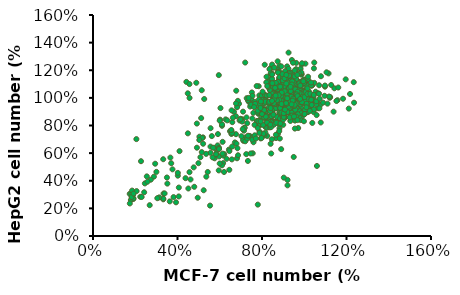
| Category | HepG2 |
|---|---|
| 0.9499618999237999 | 0.904 |
| 0.8483616967233935 | 0.895 |
| 0.9154178308356616 | 0.982 |
| 0.9621539243078486 | 0.94 |
| 0.6817373634747269 | 0.563 |
| 1.0261620523241046 | 0.958 |
| 0.9885699771399543 | 0.863 |
| 0.9560579121158242 | 0.835 |
| 0.5120650241300483 | 0.854 |
| 0.8483616967233935 | 0.812 |
| 0.9306578613157226 | 0.991 |
| 0.8859537719075438 | 0.996 |
| 0.8768097536195072 | 0.963 |
| 1.0353060706121413 | 1.005 |
| 1.0170180340360682 | 1.014 |
| 1.034290068580137 | 0.93 |
| 0.9824739649479299 | 0.921 |
| 0.969265938531877 | 0.918 |
| 0.9001778003556007 | 0.946 |
| 0.905257810515621 | 0.923 |
| 0.8757937515875032 | 0.955 |
| 0.8879857759715519 | 0.935 |
| 0.936753873507747 | 0.854 |
| 0.9865379730759462 | 0.925 |
| 1.0525781051562104 | 0.971 |
| 1.0373380746761494 | 1 |
| 0.9540259080518161 | 1.018 |
| 0.9611379222758446 | 1.062 |
| 0.9357378714757429 | 0.979 |
| 0.9499618999237999 | 0.98 |
| 1.0363220726441453 | 0.952 |
| 1.0759461518923037 | 0.949 |
| 1.0353060706121413 | 1.088 |
| 0.9824739649479299 | 0.953 |
| 0.936753873507747 | 0.979 |
| 0.9144018288036576 | 0.93 |
| 0.4490728981457963 | 0.743 |
| 1.0078740157480315 | 0.949 |
| 1.1389382778765558 | 0.9 |
| 0.9255778511557023 | 0.894 |
| 1.062738125476251 | 0.966 |
| 0.9743459486918974 | 0.984 |
| 1.032258064516129 | 0.954 |
| 0.5760731521463043 | 0.563 |
| 0.904241808483617 | 0.964 |
| 0.9357378714757429 | 0.968 |
| 0.9702819405638812 | 0.972 |
| 0.9804419608839218 | 1.044 |
| 0.9286258572517145 | 0.953 |
| 1.016002032004064 | 0.971 |
| 0.9946659893319787 | 1.055 |
| 1.0048260096520194 | 0.965 |
| 0.9306578613157226 | 0.988 |
| 1.0200660401320802 | 0.934 |
| 1.1206502413004826 | 1.001 |
| 1.0891541783083567 | 0.966 |
| 0.9479298958597917 | 1.001 |
| 0.7772415544831089 | 0.814 |
| 0.8910337820675641 | 1.035 |
| 0.9662179324358648 | 0.981 |
| 0.8625857251714504 | 0.961 |
| 0.9733299466598934 | 0.915 |
| 1.157226314452629 | 0.983 |
| 1.1836423672847345 | 0.994 |
| 0.858521717043434 | 0.997 |
| 0.9641859283718568 | 1.006 |
| 0.9133858267716536 | 0.923 |
| 0.8839217678435357 | 0.892 |
| 0.8859537719075438 | 0.967 |
| 1.030226060452121 | 0.991 |
| 0.983489966979934 | 0.839 |
| 1.016002032004064 | 0.98 |
| 0.9286258572517145 | 0.996 |
| 0.9113538227076454 | 1.092 |
| 0.8473456946913894 | 0.837 |
| 0.6136652273304547 | 0.682 |
| 0.9499618999237999 | 0.977 |
| 1.0058420116840234 | 0.981 |
| 1.1226822453644907 | 1.006 |
| 1.1176022352044703 | 1.01 |
| 0.8775356874530428 | 1.208 |
| 0.8474830954169797 | 1.176 |
| 0.9821187077385425 | 1.117 |
| 1.0001502629601804 | 1.049 |
| 0.9304282494365139 | 0.926 |
| 0.983320811419985 | 0.99 |
| 0.8883546205860255 | 1.003 |
| 0.9448534936138242 | 1.066 |
| 0.8847483095416979 | 1.129 |
| 0.909992486851991 | 1.044 |
| 0.6034560480841472 | 0.926 |
| 0.9172051089406461 | 1.033 |
| 0.9111945905334335 | 0.952 |
| 0.9051840721262209 | 1.036 |
| 0.9003756574004508 | 1.081 |
| 0.9039819684447784 | 1.06 |
| 0.9051840721262209 | 1.08 |
| 0.9460555972952667 | 0.991 |
| 0.958076634109692 | 1.014 |
| 0.5265214124718257 | 0.992 |
| 0.9208114199849737 | 0.367 |
| 0.7801652892561983 | 0.227 |
| 0.9460555972952667 | 0.978 |
| 0.983320811419985 | 0.988 |
| 1.0049586776859505 | 1.091 |
| 0.9953418482344102 | 1.004 |
| 0.988129226145755 | 0.986 |
| 0.8739293764087153 | 0.923 |
| 0.9003756574004508 | 0.805 |
| 0.9448534936138242 | 0.894 |
| 0.9484598046581517 | 0.892 |
| 1.0169797145003756 | 0.99 |
| 0.9688955672426747 | 1.022 |
| 0.7981968444778362 | 1.023 |
| 0.9184072126220887 | 1.038 |
| 0.9460555972952667 | 0.874 |
| 0.8823441021788129 | 0.893 |
| 0.8943651389932382 | 0.902 |
| 0.9051840721262209 | 0.956 |
| 0.9111945905334335 | 0.986 |
| 0.8246431254695717 | 0.971 |
| 0.9592787377911345 | 1.008 |
| 0.8883546205860255 | 1.01 |
| 0.8679188580015026 | 1.026 |
| 0.8967693463561233 | 0.967 |
| 0.783771600300526 | 0.884 |
| 0.8474830954169797 | 0.878 |
| 0.8895567242674681 | 0.933 |
| 0.667167543200601 | 0.899 |
| 0.8210368144252442 | 0.873 |
| 0.9688955672426747 | 1 |
| 0.520510894064613 | 0.714 |
| 0.8751314800901577 | 0.739 |
| 0.9712997746055597 | 0.782 |
| 0.9208114199849737 | 0.406 |
| 0.98572501878287 | 1.003 |
| 0.7441021788129226 | 0.937 |
| 0.6912096168294516 | 0.957 |
| 0.9592787377911345 | 0.929 |
| 0.8186326070623591 | 0.898 |
| 0.8246431254695717 | 0.724 |
| 0.8667167543200601 | 0.709 |
| 0.9556724267468069 | 0.778 |
| 0.4916604057099925 | 0.814 |
| 0.7597295266716755 | 0.679 |
| 0.9869271224643126 | 1.046 |
| 0.887152516904583 | 0.927 |
| 0.909992486851991 | 1.026 |
| 0.6106686701728024 | 0.798 |
| 0.9364387678437265 | 0.88 |
| 1.0446280991735537 | 0.897 |
| 0.9508640120210368 | 0.997 |
| 1.033809166040571 | 1.02 |
| 0.9340345604808414 | 0.99 |
| 0.7873779113448535 | 1.018 |
| 0.9676934635612322 | 1.051 |
| 0.8847483095416979 | 0.859 |
| 0.9496619083395943 | 0.932 |
| 1.063861758076634 | 0.925 |
| 0.9773102930127724 | 0.905 |
| 0.9427189012018106 | 1.181 |
| 0.9152489464648041 | 1.159 |
| 0.8415795223973779 | 1.216 |
| 0.9302325581395349 | 1.143 |
| 0.8503199625409709 | 1.219 |
| 0.961448415795224 | 1.208 |
| 0.9264866552208522 | 1.163 |
| 0.678008428281567 | 1.052 |
| 0.9352270953644451 | 0.965 |
| 0.9477134384267207 | 1.059 |
| 0.8827844545028875 | 1.114 |
| 0.8415795223973779 | 1.172 |
| 0.9077571406274387 | 1.151 |
| 0.8128609333541439 | 1.24 |
| 0.8365849851724676 | 1.132 |
| 0.941470266895583 | 1.274 |
| 0.9140003121585766 | 1.123 |
| 0.4570001560792883 | 1 |
| 0.83533635086624 | 1.208 |
| 0.9189948493834869 | 1.182 |
| 0.884033088809115 | 1.185 |
| 0.8802871858904323 | 1.142 |
| 0.8478226939285157 | 1.241 |
| 0.9826751990010926 | 1.211 |
| 0.9452161698142656 | 1.048 |
| 0.872795380053067 | 1.114 |
| 0.9589511471827689 | 1.13 |
| 0.4420165444045575 | 1.116 |
| 0.9976588106758233 | 1.133 |
| 0.9189948493834869 | 1.228 |
| 0.9252380209146246 | 1.21 |
| 0.904011237708756 | 1.14 |
| 0.9976588106758233 | 1.043 |
| 0.9277352895270797 | 1.062 |
| 0.9364757296706727 | 1.091 |
| 0.9227407523021695 | 1.043 |
| 0.855314499765881 | 1.054 |
| 0.9102544092398939 | 1.066 |
| 0.9876697362260028 | 1.172 |
| 0.9339784610582176 | 1.181 |
| 0.9027626034025285 | 0.968 |
| 0.9102544092398939 | 1.092 |
| 1.038863742781333 | 1.093 |
| 0.8403308880911503 | 1.055 |
| 0.83533635086624 | 1.065 |
| 0.9189948493834869 | 1.129 |
| 0.9227407523021695 | 1.109 |
| 0.9577025128765413 | 1.132 |
| 0.9364757296706727 | 1.042 |
| 0.9002653347900733 | 1.092 |
| 0.8877789917277977 | 1.093 |
| 0.8678008428281567 | 1.055 |
| 0.8653035742157016 | 1.065 |
| 0.9626970501014516 | 1.129 |
| 1.0476041829249259 | 1.109 |
| 1.0076478851256438 | 1.132 |
| 0.9152489464648041 | 1.028 |
| 0.8915248946464804 | 1.022 |
| 0.9676915873263618 | 1.086 |
| 0.9764320274699547 | 1.016 |
| 0.9214921179959419 | 1.154 |
| 1.0963009208678007 | 1.015 |
| 1.1150304354612144 | 1.177 |
| 1.1425003901982207 | 1.07 |
| 1.0563446230685187 | 0.952 |
| 0.9252380209146246 | 0.938 |
| 0.9589511471827689 | 1.049 |
| 0.7978773216794132 | 0.92 |
| 0.9851724676135477 | 0.999 |
| 1.0538473544560636 | 1.045 |
| 1.0650850632121118 | 1.033 |
| 0.9664429530201343 | 1.002 |
| 0.9577025128765413 | 0.862 |
| 0.9514593413454034 | 0.903 |
| 1.0438582800062433 | 1.006 |
| 0.904011237708756 | 0.92 |
| 0.6105821757452786 | 0.808 |
| 1.0176369595754644 | 0.897 |
| 1.0451069143124707 | 0.917 |
| 1.110035898236304 | 0.958 |
| 1.0180699730872742 | 1.132 |
| 0.9862873253876714 | 1.168 |
| 0.9463027040881712 | 0.966 |
| 0.878636421889017 | 1.12 |
| 0.9698833781878765 | 1.119 |
| 0.9196462898885044 | 0.987 |
| 0.9257977700884276 | 1.106 |
| 0.8929898756888376 | 1.056 |
| 1.0354991669870564 | 0.988 |
| 0.9965397923875432 | 0.885 |
| 0.9134948096885813 | 1.059 |
| 0.9268230167884147 | 1.177 |
| 0.9104190695886197 | 1.066 |
| 0.8745354350890683 | 1.189 |
| 0.8581314878892734 | 1.219 |
| 1.0180699730872742 | 1.153 |
| 1.0703575547866204 | 1.091 |
| 0.9780853517877739 | 1.098 |
| 0.8499295142893759 | 1.118 |
| 0.9698833781878765 | 1.055 |
| 0.9309240035883635 | 0.954 |
| 0.9534794309880815 | 1.03 |
| 0.9709086248878637 | 1.096 |
| 0.9422017172882224 | 1.082 |
| 1.0129437395873382 | 1.095 |
| 0.8940151223888249 | 1.121 |
| 0.9339997436883251 | 1.077 |
| 0.8806869152889915 | 1.107 |
| 0.9852620786876842 | 1.177 |
| 0.939125977188261 | 1.084 |
| 0.9575804177880303 | 1.06 |
| 0.9545046776880687 | 1.199 |
| 1.0262719466871717 | 0.953 |
| 0.9381007304882737 | 0.944 |
| 0.9504036908881199 | 1.036 |
| 0.9360502370882994 | 1.128 |
| 0.9022170959887222 | 1.09 |
| 0.9339997436883251 | 1.083 |
| 0.9257977700884276 | 1.328 |
| 0.972959118287838 | 1.112 |
| 0.8468537741894143 | 0.7 |
| 0.9914135588876073 | 0.964 |
| 0.9534794309880815 | 0.979 |
| 0.9001666025887479 | 0.984 |
| 0.8970908624887863 | 1.11 |
| 0.9442522106881969 | 1.143 |
| 0.8673587081891581 | 1.064 |
| 0.9627066512879662 | 1.038 |
| 1.000640779187492 | 0.981 |
| 0.9350249903883122 | 1.079 |
| 0.9073433294886583 | 0.955 |
| 0.995514545687556 | 1.031 |
| 0.9145200563885685 | 1.099 |
| 0.9134948096885813 | 0.978 |
| 0.9093938228886326 | 1.193 |
| 0.9339997436883251 | 0.965 |
| 0.9216967832884788 | 0.908 |
| 0.9780853517877739 | 0.868 |
| 0.9268230167884147 | 0.953 |
| 0.9791105984877612 | 1.069 |
| 0.9032423426887095 | 0.423 |
| 0.9483531974881456 | 0.97 |
| 0.9401512238882481 | 1.098 |
| 0.8601819812892477 | 0.951 |
| 0.9206715365884917 | 0.938 |
| 0.9442522106881969 | 0.953 |
| 0.9637318979879533 | 0.927 |
| 1.0108932461873639 | 0.957 |
| 0.9339997436883251 | 0.983 |
| 0.9514289375881071 | 0.982 |
| 0.9319492502883506 | 1.064 |
| 0.8960656157887992 | 0.997 |
| 0.9001666025887479 | 0.949 |
| 0.939125977188261 | 0.893 |
| 0.9862873253876714 | 0.889 |
| 1.0037165192874535 | 0.914 |
| 1.000640779187492 | 0.881 |
| 1.0016660258874792 | 0.883 |
| 1.0098679994873767 | 0.932 |
| 0.9657823913879278 | 0.961 |
| 0.8424450272342142 | 1.02 |
| 0.9618721000605205 | 1.253 |
| 0.9166834779100262 | 1.169 |
| 0.7843453701835787 | 1.084 |
| 0.7746620940084729 | 1.086 |
| 0.936050030260238 | 1.05 |
| 0.9812386524107323 | 1.086 |
| 0.9876941698608029 | 1.241 |
| 0.9860802904982853 | 1.185 |
| 0.9505749445228969 | 1.133 |
| 0.8117813193463789 | 0.919 |
| 0.45672785959249546 | 1.1 |
| 0.9070002017349204 | 1.112 |
| 0.8827920112971556 | 1.062 |
| 0.3340730280411539 | 0.307 |
| 1.0038329634859795 | 1.113 |
| 0.9634859794230382 | 1.039 |
| 0.4486584627799072 | 1.033 |
| 0.9344361508977204 | 1.07 |
| 0.8456727859592496 | 1.092 |
| 0.802098043171273 | 0.892 |
| 0.8182368367964494 | 0.847 |
| 1.0215856364736735 | 1.047 |
| 1.032882792011297 | 1.091 |
| 0.8827920112971556 | 1.233 |
| 0.4793221706677426 | 0.356 |
| 0.9473471857978616 | 1.12 |
| 0.9215251159975791 | 1.15 |
| 0.8827920112971556 | 1.15 |
| 0.9118418398224732 | 1.092 |
| 0.8682670970344967 | 1.084 |
| 1.005446842848497 | 1.248 |
| 0.5955214847690136 | 1.165 |
| 0.9231389953600968 | 0.991 |
| 0.9505749445228969 | 1.146 |
| 0.9473471857978616 | 1.076 |
| 0.9538027032479323 | 1.104 |
| 0.9005446842848497 | 0.944 |
| 0.4890054468428485 | 1.109 |
| 0.9893080492233206 | 1.25 |
| 0.7520677829332257 | 1.039 |
| 0.7891870082711318 | 0.942 |
| 0.9747831349606617 | 1.177 |
| 0.9344361508977204 | 1.105 |
| 0.9134557191849909 | 1.138 |
| 0.9909219285858382 | 1.005 |
| 0.6277990720193666 | 0.844 |
| 1.047407706273956 | 1.256 |
| 0.9005446842848497 | 1.082 |
| 0.940891668347791 | 0.987 |
| 0.9521888238854146 | 1.133 |
| 0.9150695985475086 | 0.977 |
| 0.9989913253984265 | 1.108 |
| 0.936050030260238 | 1.086 |
| 0.9021585636473674 | 1.112 |
| 0.514827516643131 | 1.055 |
| 0.8440589065967319 | 1.033 |
| 0.8537421827718378 | 1.005 |
| 0.898930804922332 | 1.146 |
| 0.8263062336090378 | 1.115 |
| 0.8747226144845672 | 1.062 |
| 0.8698809763970143 | 1.075 |
| 0.8601977002219084 | 1.099 |
| 0.9602582206980028 | 1.128 |
| 0.6939681258825903 | 0.836 |
| 0.9005446842848497 | 1.037 |
| 0.9279806334476498 | 1.161 |
| 0.9215251159975791 | 1.111 |
| 0.9618721000605205 | 1.136 |
| 0.978010893685697 | 0.984 |
| 1.0457938269114384 | 1.214 |
| 1.032882792011297 | 0.987 |
| 0.9425055477103087 | 0.977 |
| 0.8133951987088965 | 0.991 |
| 0.8279201129715553 | 0.975 |
| 0.9021585636473674 | 1.01 |
| 0.9909219285858382 | 1.12 |
| 0.9554165826104498 | 1.013 |
| 0.9812386524107323 | 1.09 |
| 1.0780714141617913 | 0.822 |
| 0.5663830470380479 | 0.569 |
| 0.3390592390431851 | 0.308 |
| 0.2684218975758549 | 0.223 |
| 0.8604912506020228 | 1.073 |
| 0.7500401348531064 | 0.985 |
| 0.8437951517097447 | 1.073 |
| 0.7371969818590464 | 0.972 |
| 0.9580992133568791 | 1.061 |
| 0.5085888585647776 | 0.57 |
| 0.33263766254615507 | 0.266 |
| 0.5625301011398298 | 0.723 |
| 0.6819714239845882 | 0.933 |
| 0.8759030341948948 | 1.117 |
| 0.8592069353026168 | 0.979 |
| 0.946540375662225 | 1.255 |
| 0.8476480976079628 | 1.138 |
| 0.33263766254615507 | 0.27 |
| 0.5779418847327019 | 0.636 |
| 0.8142558998234066 | 1.003 |
| 0.8476480976079628 | 0.98 |
| 0.8990207095842029 | 1.127 |
| 0.7795793867394445 | 0.948 |
| 0.8283833681168727 | 0.969 |
| 0.7988441162305346 | 1.015 |
| 0.911863862578263 | 1.077 |
| 0.7102263605715203 | 0.9 |
| 0.5561085246427998 | 0.603 |
| 0.31337293305506503 | 0.279 |
| 0.6858243698828063 | 0.979 |
| 0.7063734146733023 | 0.845 |
| 0.304382725959223 | 0.274 |
| 0.8656285117996468 | 0.826 |
| 0.7423342430566704 | 0.724 |
| 0.7654519184459785 | 0.972 |
| 0.3634612297318992 | 0.251 |
| 0.7988441162305346 | 0.985 |
| 0.7590303419489485 | 0.718 |
| 0.8848932412907369 | 1.02 |
| 0.6434419650024081 | 0.626 |
| 0.7205008829667684 | 1.256 |
| 0.5240006421576497 | 0.331 |
| 0.7333440359608284 | 0.983 |
| 0.7564617113501365 | 0.959 |
| 0.648579226200032 | 0.759 |
| 0.8759030341948948 | 1.082 |
| 0.906726601380639 | 1.142 |
| 0.8861775565901429 | 1.081 |
| 0.8373735752127147 | 1.057 |
| 0.8116872692245947 | 0.728 |
| 0.8168245304222187 | 0.892 |
| 0.8412265211109328 | 0.938 |
| 0.4957457055707176 | 0.277 |
| 0.6768341627869642 | 0.737 |
| 0.8348049446139028 | 0.861 |
| 0.8913148177877669 | 0.959 |
| 0.8142558998234066 | 1.021 |
| 0.8913148177877669 | 0.954 |
| 0.8656285117996468 | 1.109 |
| 0.8296676834162787 | 1.079 |
| 0.8694814576978648 | 0.994 |
| 0.38144164392358326 | 0.282 |
| 0.40584363461229733 | 0.286 |
| 0.4379515170974474 | 0.419 |
| 0.8232461069192487 | 1.017 |
| 0.8348049446139028 | 1.02 |
| 0.8001284315299406 | 0.951 |
| 0.8489324129073688 | 1.106 |
| 0.8104029539251887 | 0.913 |
| 0.8592069353026168 | 0.949 |
| 0.6716969015893401 | 0.677 |
| 0.8861775565901429 | 0.927 |
| 0.9503933215604431 | 1.114 |
| 0.39300048161823725 | 0.244 |
| 0.635736073205972 | 0.837 |
| 0.7937068550329106 | 0.847 |
| 0.7487558195537004 | 0.951 |
| 0.8155402151228126 | 0.981 |
| 0.8399422058115267 | 0.927 |
| 0.8925991330871729 | 1.044 |
| 0.8759030341948948 | 1.183 |
| 0.7657393850658858 | 0.729 |
| 0.9985358711566618 | 0.831 |
| 1.0717423133235724 | 0.924 |
| 0.3762811127379209 | 0.483 |
| 1.0702781844802343 | 1.03 |
| 1.0571010248901904 | 0.975 |
| 1.0351390922401171 | 0.949 |
| 1.2108345534407028 | 0.922 |
| 0.9019033674963397 | 0.89 |
| 0.49194729136163984 | 0.639 |
| 0.7920937042459737 | 0.831 |
| 0.8843338213762811 | 0.994 |
| 0.821376281112738 | 0.79 |
| 0.8345534407027818 | 0.806 |
| 0.4568081991215227 | 0.462 |
| 0.9692532942898975 | 0.882 |
| 0.6764275256222547 | 0.867 |
| 0.5036603221083455 | 0.719 |
| 0.8784773060029283 | 0.973 |
| 0.8330893118594437 | 0.933 |
| 0.7276720351390923 | 0.998 |
| 0.34992679355783307 | 0.424 |
| 1.0790629575402635 | 1.157 |
| 1.1522693997071742 | 0.977 |
| 0.9106881405563689 | 0.859 |
| 0.9150805270863837 | 1.004 |
| 0.8843338213762811 | 1.028 |
| 0.8872620790629575 | 0.884 |
| 1.0732064421669107 | 0.994 |
| 1.2342606149341142 | 1.114 |
| 1.1961932650073206 | 1.134 |
| 1.0600292825768667 | 0.507 |
| 0.8740849194729137 | 1.264 |
| 0.8916544655929722 | 1.228 |
| 0.9150805270863837 | 1.104 |
| 0.91800878477306 | 0.896 |
| 0.9765739385065886 | 0.998 |
| 1.026354319180088 | 0.906 |
| 1.0014641288433381 | 1.006 |
| 1.0585651537335286 | 0.876 |
| 1.0380673499267936 | 0.819 |
| 0.8667642752562226 | 0.833 |
| 0.83601756954612 | 0.843 |
| 0.9575402635431918 | 0.914 |
| 1.1054172767203514 | 1.185 |
| 1.1273792093704247 | 1.093 |
| 1.1610541727672035 | 1.075 |
| 0.9516837481698389 | 0.943 |
| 0.6588579795021962 | 0.647 |
| 0.2547584187408492 | 0.432 |
| 0.9150805270863837 | 0.928 |
| 0.2884333821376281 | 0.43 |
| 0.8374816983894583 | 0.861 |
| 1.0980966325036603 | 1.081 |
| 0.9956076134699854 | 1.12 |
| 1.2357247437774523 | 0.965 |
| 0.9619326500732065 | 0.863 |
| 0.7159590043923866 | 0.784 |
| 0.9077598828696926 | 0.955 |
| 0.8169838945827232 | 0.788 |
| 0.9502196193265008 | 0.572 |
| 0.8535871156661786 | 0.882 |
| 1.0980966325036603 | 1.089 |
| 1.2166910688140555 | 1.028 |
| 0.9677891654465594 | 0.839 |
| 0.5212298682284041 | 0.668 |
| 0.29428989751098095 | 0.523 |
| 0.9707174231332357 | 1.036 |
| 0.3323572474377745 | 0.556 |
| 0.3001464128843338 | 0.464 |
| 0.6456808199121523 | 0.615 |
| 0.9399707174231332 | 1.008 |
| 0.8828696925329429 | 0.78 |
| 0.9341142020497804 | 0.833 |
| 0.8448023426061494 | 0.867 |
| 0.849194729136164 | 0.827 |
| 0.8535871156661786 | 0.819 |
| 0.7759882869692533 | 0.833 |
| 0.8814055636896047 | 0.808 |
| 0.7935578330893118 | 0.707 |
| 0.6203150461705594 | 0.463 |
| 0.8843020097772949 | 0.706 |
| 0.6865833785985878 | 0.585 |
| 0.7332971211298207 | 0.543 |
| 0.8908202064095601 | 0.629 |
| 0.8245518739815317 | 0.784 |
| 0.8669201520912547 | 0.828 |
| 0.8614883215643672 | 0.922 |
| 0.6572514937533949 | 0.555 |
| 0.35198261814231396 | 0.379 |
| 0.5953286257468767 | 0.475 |
| 0.9082020640956002 | 0.86 |
| 0.19120043454644214 | 0.268 |
| 0.24551873981531777 | 0.381 |
| 0.40630092341118956 | 0.351 |
| 0.20640956002172733 | 0.325 |
| 0.5431830526887561 | 0.463 |
| 0.7300380228136882 | 0.817 |
| 0.6550787615426399 | 0.739 |
| 0.7897881586094514 | 0.828 |
| 0.6768060836501901 | 0.96 |
| 0.755024443237371 | 1.015 |
| 0.22379141770776753 | 0.284 |
| 0.8039109179793591 | 0.73 |
| 0.18902770233568714 | 0.297 |
| 0.7126561651276481 | 0.689 |
| 0.23030961434003258 | 0.282 |
| 0.6159695817490495 | 0.528 |
| 0.8158609451385117 | 0.749 |
| 0.18468223791417707 | 0.289 |
| 0.5975013579576317 | 0.576 |
| 0.892992938620315 | 0.871 |
| 0.8104291146116241 | 0.858 |
| 0.7876154263986963 | 0.89 |
| 0.6550787615426399 | 0.76 |
| 0.7887017925040739 | 0.756 |
| 0.1792504073872895 | 0.261 |
| 0.65942422596415 | 0.824 |
| 0.7561108093427485 | 0.599 |
| 0.8028245518739815 | 0.893 |
| 0.7463335143943509 | 0.597 |
| 0.6105377512221619 | 0.512 |
| 0.5844649646931016 | 0.6 |
| 0.19120043454644214 | 0.272 |
| 0.4095600217273221 | 0.615 |
| 0.793047256925584 | 0.804 |
| 0.8821292775665399 | 0.82 |
| 0.8408473655621944 | 0.667 |
| 0.2737642585551331 | 0.408 |
| 0.24225964149918522 | 0.317 |
| 0.5822922324823465 | 0.592 |
| 0.8071700162954916 | 0.903 |
| 0.8973384030418251 | 0.952 |
| 0.7897881586094514 | 0.81 |
| 0.8658337859858772 | 0.733 |
| 0.7539380771319935 | 0.697 |
| 0.5562194459532862 | 0.647 |
| 0.8202064095600218 | 0.87 |
| 0.8180336773492667 | 0.864 |
| 0.6453014665942423 | 0.479 |
| 0.931015752308528 | 0.86 |
| 0.9538294405214557 | 0.941 |
| 0.8701792504073873 | 0.863 |
| 0.6322650733297122 | 0.559 |
| 0.935361216730038 | 0.937 |
| 0.7202607278652906 | 0.713 |
| 0.7180879956545356 | 0.783 |
| 0.710483432916893 | 0.696 |
| 0.5355784899511136 | 0.595 |
| 0.5898967952199892 | 0.656 |
| 0.5149375339489408 | 0.607 |
| 0.5964149918522542 | 0.639 |
| 0.7854426941879413 | 0.988 |
| 0.8560564910374796 | 0.806 |
| 0.20532319391634982 | 0.701 |
| 0.931015752308528 | 0.927 |
| 0.8853883758826725 | 0.851 |
| 0.4617055947854427 | 0.409 |
| 0.17381857686040195 | 0.305 |
| 0.6789788158609451 | 0.669 |
| 0.8134220422331502 | 0.961 |
| 0.7266415967601967 | 0.859 |
| 0.7208562337286665 | 0.686 |
| 0.7058142898466879 | 0.829 |
| 0.8238356956899046 | 0.821 |
| 0.4767139137980908 | 0.497 |
| 0.8157361874457623 | 0.971 |
| 0.6016777552791438 | 0.842 |
| 0.7254845241538906 | 0.593 |
| 0.5565519236332079 | 0.78 |
| 0.759039629736766 | 0.892 |
| 0.7914376627133353 | 0.955 |
| 0.7787098640439688 | 0.895 |
| 0.8203644778709864 | 1.112 |
| 0.8967312698871854 | 1.172 |
| 0.6560601677755279 | 0.91 |
| 0.8620190916980041 | 1.073 |
| 0.8249927682962106 | 1.085 |
| 0.18166039919004917 | 0.309 |
| 0.8030083887763957 | 1.045 |
| 0.37026323401793465 | 0.527 |
| 0.8411917847844952 | 1.177 |
| 0.8481342204223316 | 1.169 |
| 0.8562337286664738 | 1.001 |
| 0.8678044547295343 | 0.82 |
| 0.8921029794619613 | 0.893 |
| 0.8573908012727799 | 0.953 |
| 0.8215215504772925 | 1.153 |
| 0.9430141741394272 | 1.12 |
| 0.9245010124385306 | 1.055 |
| 0.1828174717963552 | 0.282 |
| 0.18513161700896733 | 0.329 |
| 0.6213479895863465 | 0.593 |
| 0.8435059299971073 | 0.597 |
| 0.8516054382412497 | 0.985 |
| 0.7648249927682962 | 0.805 |
| 0.9187156494070002 | 1.03 |
| 0.9407000289268151 | 1.097 |
| 0.8874746890367371 | 0.815 |
| 1.0321087648249927 | 1.111 |
| 0.6167196991611223 | 0.582 |
| 0.2580271912062482 | 0.393 |
| 0.7798669366502748 | 0.782 |
| 0.8816893260052068 | 0.759 |
| 0.9152444315880821 | 0.931 |
| 0.8921029794619613 | 0.98 |
| 0.8458200752097194 | 0.962 |
| 0.9545849002024877 | 1.156 |
| 0.9418571015331212 | 0.872 |
| 0.8064796065953138 | 0.74 |
| 0.9140873589817761 | 0.97 |
| 0.9441712467457333 | 0.982 |
| 0.7879664448944171 | 0.746 |
| 0.8909459068556552 | 1.015 |
| 0.9245010124385306 | 1.067 |
| 0.9279722302574487 | 1.051 |
| 0.9638414810529361 | 1.013 |
| 1.0066531674862598 | 1.043 |
| 0.8469771478160255 | 0.911 |
| 0.9152444315880821 | 1.166 |
| 0.9071449233439398 | 1.048 |
| 0.9279722302574487 | 1.072 |
| 0.936071738501591 | 1.049 |
| 0.8816893260052068 | 0.986 |
| 0.8978883424934915 | 0.86 |
| 1.0147526757304022 | 1.028 |
| 1.0286375470060747 | 1.03 |
| 0.9545849002024877 | 0.95 |
| 0.9256580850448366 | 0.974 |
| 0.9164015041943882 | 0.958 |
| 0.9777263523286086 | 1.037 |
| 0.9673126988718542 | 1.166 |
| 0.9036737055250217 | 0.862 |
| 0.9823546427538328 | 0.97 |
| 0.8053225339890078 | 0.805 |
| 1.0147526757304022 | 1.069 |
| 0.9638414810529361 | 1.019 |
| 0.9164015041943882 | 0.931 |
| 0.9684697714781603 | 1.045 |
| 0.9638414810529361 | 1.025 |
| 0.40155642023346305 | 0.437 |
| 0.930739299610895 | 0.858 |
| 0.9473411154345006 | 0.995 |
| 0.8103761348897536 | 0.912 |
| 0.7802853437094682 | 0.907 |
| 0.7833981841763943 | 0.831 |
| 0.8539559014267185 | 0.878 |
| 0.8238651102464332 | 0.821 |
| 0.5364461738002594 | 0.43 |
| 0.45136186770428016 | 0.344 |
| 0.9006485084306096 | 0.843 |
| 0.7304798962386511 | 0.706 |
| 0.9255512321660182 | 0.937 |
| 0.9027237354085603 | 0.862 |
| 0.5540856031128405 | 0.22 |
| 0.1743190661478599 | 0.236 |
| 0.5686121919584954 | 0.639 |
| 0.6132295719844358 | 0.596 |
| 0.8363164721141375 | 0.787 |
| 0.698313878080415 | 0.849 |
| 0.8 | 0.883 |
| 0.7979247730220493 | 0.709 |
| 0.9068741893644617 | 0.89 |
| 0.9452658884565499 | 0.981 |
| 0.8705577172503243 | 0.982 |
| 0.5966277561608301 | 0.63 |
| 0.6619974059662775 | 0.856 |
| 0.77094682230869 | 0.706 |
| 0.7149156939040208 | 0.763 |
| 0.8425421530479896 | 0.788 |
| 0.5914396887159533 | 0.738 |
| 0.8560311284046692 | 0.962 |
| 0.5997405966277561 | 0.525 |
| 0.7086900129701686 | 0.774 |
| 0.6837872892347601 | 0.636 |
| 0.49909208819714657 | 0.527 |
| 0.7543450064850843 | 0.851 |
| 0.919325551232166 | 0.996 |
| 0.8404669260700389 | 0.969 |
| 0.8581063553826199 | 0.991 |
| 0.5167315175097277 | 0.709 |
| 0.503242542153048 | 0.695 |
| 0.8321660181582361 | 0.965 |
| 0.8352788586251622 | 0.972 |
| 0.8383916990920882 | 0.903 |
| 0.7367055771725033 | 1 |
| 0.767833981841764 | 0.957 |
| 0.7626459143968871 | 0.933 |
| 0.7024643320363164 | 0.722 |
| 0.9680933852140078 | 1.013 |
| 1.0448767833981842 | 1.021 |
| 0.9203631647211413 | 0.897 |
| 0.951491569390402 | 0.865 |
| 0.8933852140077821 | 1.038 |
| 0.3662775616083009 | 0.568 |
| 0.7948119325551232 | 0.974 |
| 0.9162127107652399 | 0.954 |
| 0.8394293125810636 | 0.806 |
| 0.9400778210116731 | 0.953 |
| 0.8788586251621271 | 1.019 |
| 0.8404669260700389 | 0.926 |
| 0.7927367055771725 | 0.927 |
| 0.6578469520103761 | 0.746 |
| 0.9348897535667964 | 1.081 |
| 0.9027237354085603 | 0.889 |
| 0.988845654993515 | 0.969 |
| 0.9089494163424124 | 0.915 |
| 0.8477302204928664 | 0.978 |
| 0.6547341115434501 | 0.768 |
| 0.5997405966277561 | 0.835 |
| 0.6972762645914397 | 0.844 |
| 0.191958495460441 | 0.307 |
| 0.980544747081712 | 0.993 |
| 0.7335927367055771 | 0.726 |
| 0.7937743190661478 | 0.83 |
| 0.40155642023346305 | 0.457 |
| 0.9141374837872892 | 0.962 |
| 0.8923476005188068 | 0.956 |
| 0.2272373540856031 | 0.542 |
| 0.8643320363164722 | 1.016 |